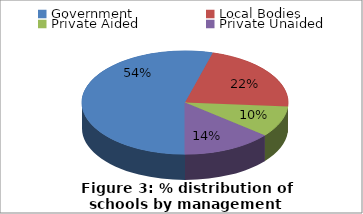
| Category | Series 0 |
|---|---|
| Government | 723088 |
| Local Bodies | 291253 |
| Private Aided | 129217 |
| Private Unaided | 187220 |